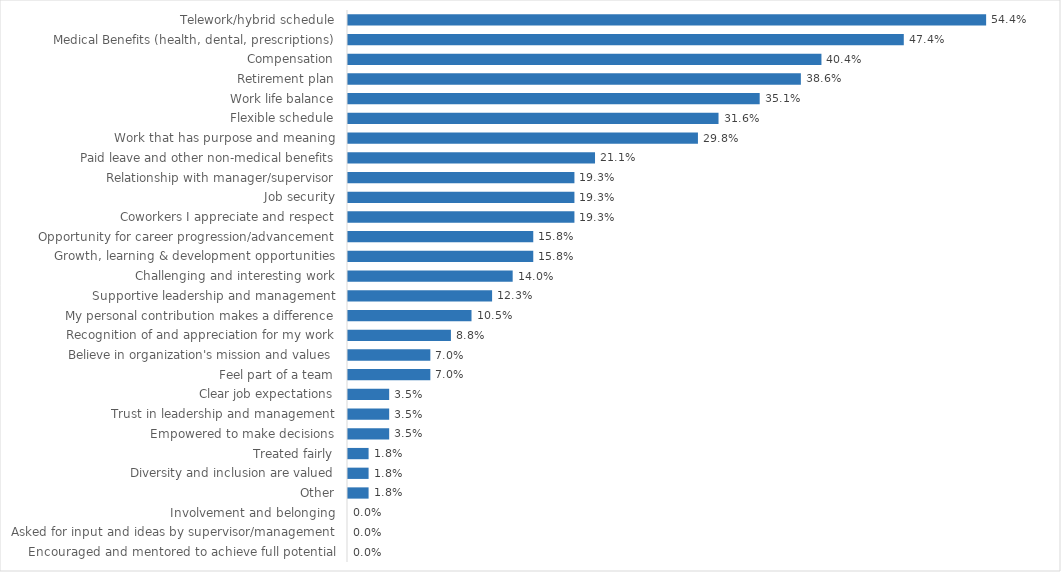
| Category | Agency of Human Services - CO |
|---|---|
| Telework/hybrid schedule | 0.544 |
| Medical Benefits (health, dental, prescriptions) | 0.474 |
| Compensation | 0.404 |
| Retirement plan | 0.386 |
| Work life balance | 0.351 |
| Flexible schedule | 0.316 |
| Work that has purpose and meaning | 0.298 |
| Paid leave and other non-medical benefits | 0.211 |
| Relationship with manager/supervisor | 0.193 |
| Job security | 0.193 |
| Coworkers I appreciate and respect | 0.193 |
| Opportunity for career progression/advancement | 0.158 |
| Growth, learning & development opportunities | 0.158 |
| Challenging and interesting work | 0.14 |
| Supportive leadership and management | 0.123 |
| My personal contribution makes a difference | 0.105 |
| Recognition of and appreciation for my work | 0.088 |
| Believe in organization's mission and values | 0.07 |
| Feel part of a team | 0.07 |
| Clear job expectations | 0.035 |
| Trust in leadership and management | 0.035 |
| Empowered to make decisions | 0.035 |
| Treated fairly | 0.018 |
| Diversity and inclusion are valued | 0.018 |
| Other | 0.018 |
| Involvement and belonging | 0 |
| Asked for input and ideas by supervisor/management | 0 |
| Encouraged and mentored to achieve full potential | 0 |